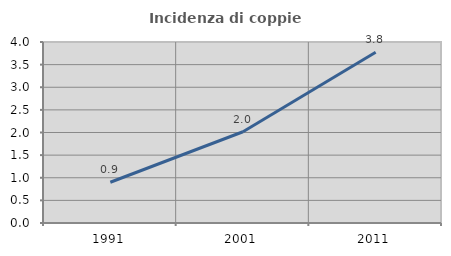
| Category | Incidenza di coppie miste |
|---|---|
| 1991.0 | 0.901 |
| 2001.0 | 2.016 |
| 2011.0 | 3.774 |